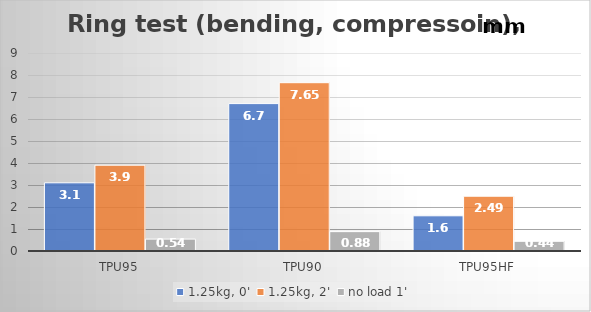
| Category | 1.25kg, 0' | 1.25kg, 2' | no load 1' |
|---|---|---|---|
| TPU95 | 3.1 | 3.9 | 0.54 |
| TPU90 | 6.7 | 7.65 | 0.88 |
| TPU95HF | 1.6 | 2.49 | 0.44 |